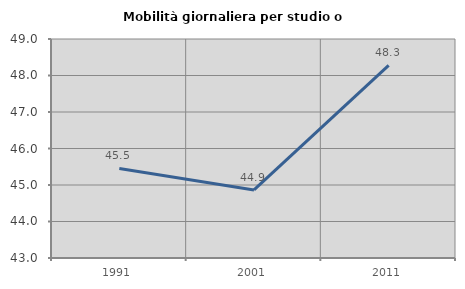
| Category | Mobilità giornaliera per studio o lavoro |
|---|---|
| 1991.0 | 45.455 |
| 2001.0 | 44.865 |
| 2011.0 | 48.276 |